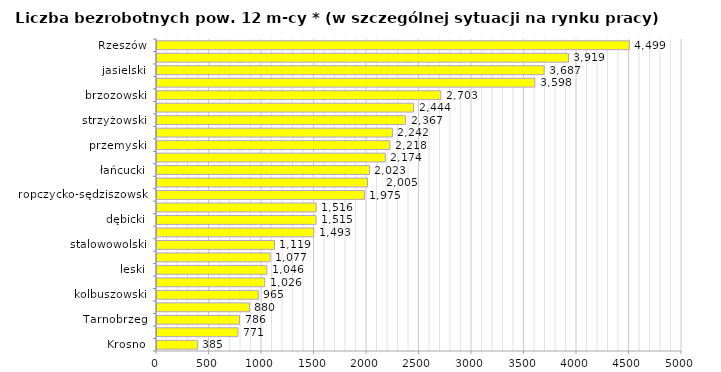
| Category | Liczba bezrobotnych powyżej 12 miesięcy* - w szczególnej sytuacji na rynku pracy |
|---|---|
| Krosno | 385 |
| bieszczadzki | 771 |
| Tarnobrzeg | 786 |
| tarnobrzeski  | 880 |
| kolbuszowski | 965 |
| krośnieński | 1026 |
| leski | 1046 |
| lubaczowski | 1077 |
| stalowowolski | 1119 |
| sanocki | 1493 |
| dębicki | 1515 |
| mielecki | 1516 |
| ropczycko-sędziszowski | 1975 |
| Przemyśl | 2005 |
| łańcucki | 2023 |
| niżański | 2174 |
| przemyski | 2218 |
| leżajski | 2242 |
| strzyżowski | 2367 |
| przeworski | 2444 |
| brzozowski | 2703 |
| jarosławski | 3598 |
| jasielski | 3687 |
| rzeszowski | 3919 |
| Rzeszów | 4499 |